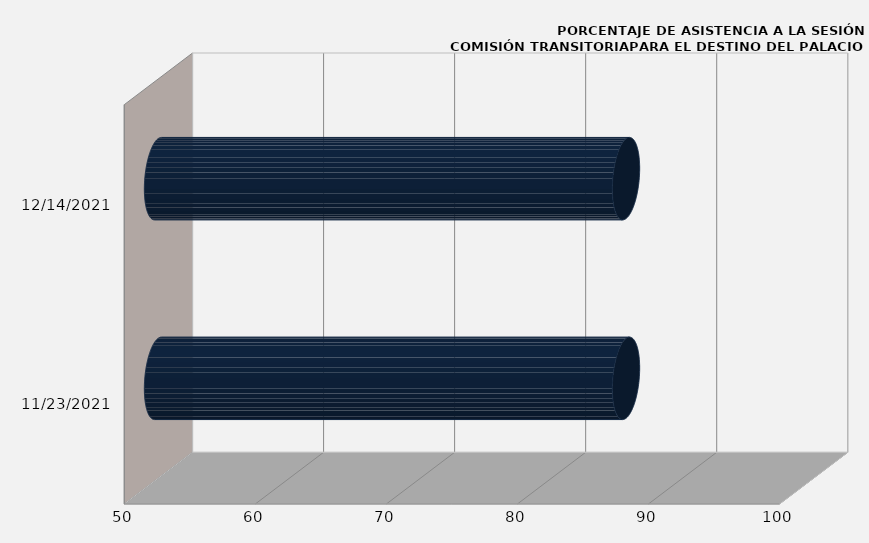
| Category | Series 0 |
|---|---|
| 11/23/21 | 85.714 |
| 12/14/21 | 85.714 |